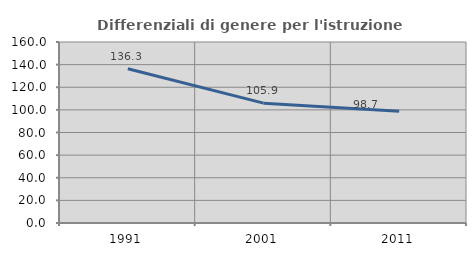
| Category | Differenziali di genere per l'istruzione superiore |
|---|---|
| 1991.0 | 136.319 |
| 2001.0 | 105.95 |
| 2011.0 | 98.695 |